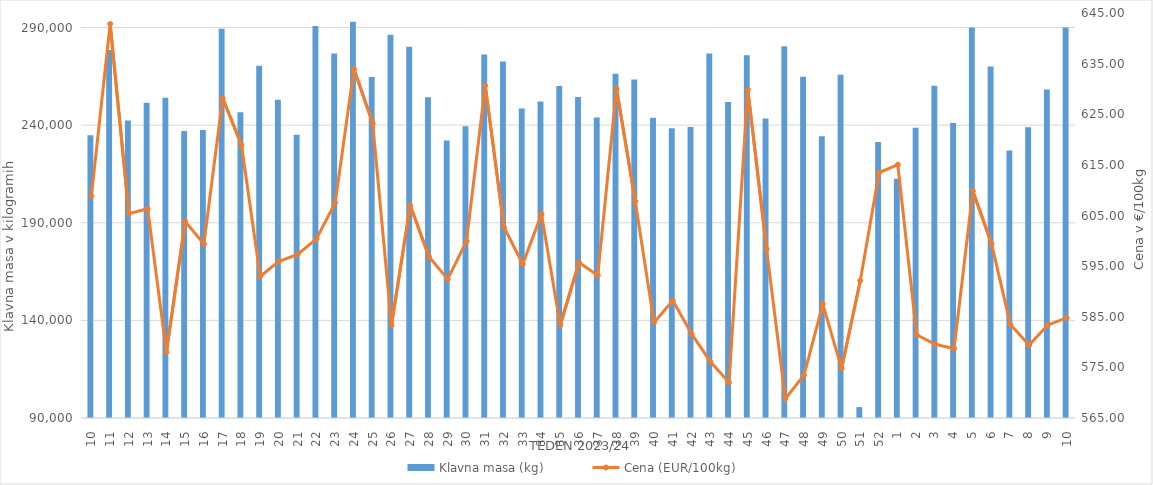
| Category | Klavna masa (kg) |
|---|---|
| 10.0 | 234762 |
| 11.0 | 278467 |
| 12.0 | 242369 |
| 13.0 | 251507 |
| 14.0 | 254072 |
| 15.0 | 236964 |
| 16.0 | 237552 |
| 17.0 | 289400 |
| 18.0 | 246616 |
| 19.0 | 270374 |
| 20.0 | 252984 |
| 21.0 | 235060 |
| 22.0 | 290816 |
| 23.0 | 276702 |
| 24.0 | 292976 |
| 25.0 | 264669 |
| 26.0 | 286237 |
| 27.0 | 280112 |
| 28.0 | 254336 |
| 29.0 | 232178 |
| 30.0 | 239437 |
| 31.0 | 276163 |
| 32.0 | 272647 |
| 33.0 | 248536 |
| 34.0 | 252050 |
| 35.0 | 260110 |
| 36.0 | 254389 |
| 37.0 | 243933 |
| 38.0 | 266321 |
| 39.0 | 263346 |
| 40.0 | 243765 |
| 41.0 | 238404 |
| 42.0 | 239007 |
| 43.0 | 276684 |
| 44.0 | 251832 |
| 45.0 | 275816 |
| 46.0 | 243425 |
| 47.0 | 280350 |
| 48.0 | 264849 |
| 49.0 | 234308 |
| 50.0 | 265786 |
| 51.0 | 95590 |
| 52.0 | 231370 |
| 1.0 | 212581 |
| 2.0 | 238607 |
| 3.0 | 260140 |
| 4.0 | 241148 |
| 5.0 | 290049 |
| 6.0 | 270025 |
| 7.0 | 227057 |
| 8.0 | 238927 |
| 9.0 | 258215 |
| 10.0 | 290025 |